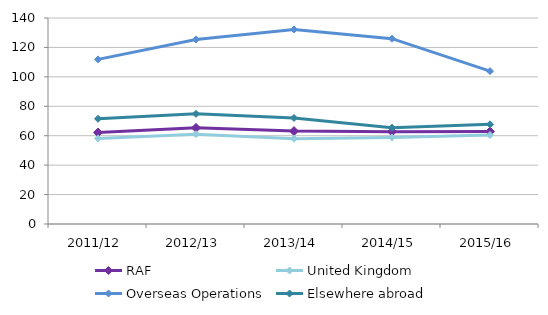
| Category | RAF | United Kingdom | Overseas Operations | Elsewhere abroad |
|---|---|---|---|---|
| 2011/12 | 62.163 | 58.146 | 111.889 | 71.522 |
| 2012/13 | 65.335 | 61.023 | 125.416 | 74.862 |
| 2013/14 | 63.141 | 58.009 | 132.198 | 72.044 |
| 2014/15 | 62.704 | 58.802 | 125.936 | 65.447 |
| 2015/16 | 62.843 | 60.472 | 103.89 | 67.737 |